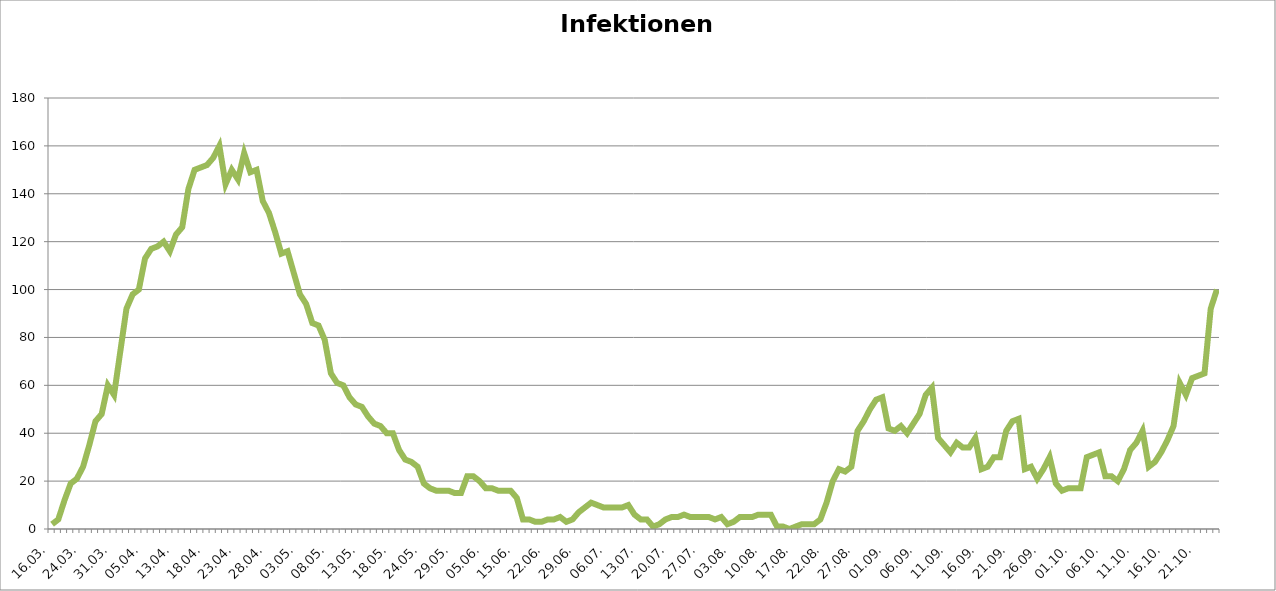
| Category | Infektionen
aktuell |
|---|---|
| 16.03. | 2 |
| 18.03. | 4 |
| 19.03. | 12 |
| 20.03. | 19 |
| 23.03. | 21 |
| 24.03. | 26 |
| 25.03. | 35 |
| 26.03. | 45 |
| 27.03. | 48 |
| 30.03. | 60 |
| 31.03. | 56 |
| 01.04. | 74 |
| 02.04. | 92 |
| 03.04. | 98 |
| 04.04. | 100 |
| 05.04. | 113 |
| 06.04. | 117 |
| 07.04. | 118 |
| 08.04. | 120 |
| 09.04. | 116 |
| 13.04. | 123 |
| 14.04. | 126 |
| 15.04. | 142 |
| 16.04. | 150 |
| 17.04. | 151 |
| 18.04. | 152 |
| 19.04. | 155 |
| 20.04. | 160 |
| 21.04. | 144 |
| 22.04. | 150 |
| 23.04. | 146 |
| 24.04. | 157 |
| 25.04. | 149 |
| 26.04. | 150 |
| 27.04. | 137 |
| 28.04. | 132 |
| 29.04. | 124 |
| 30.04. | 115 |
| 01.05. | 116 |
| 02.05. | 107 |
| 03.05. | 98 |
| 04.05. | 94 |
| 05.05. | 86 |
| 06.05. | 85 |
| 07.05. | 79 |
| 08.05. | 65 |
| 09.05. | 61 |
| 10.05. | 60 |
| 11.05. | 55 |
| 12.05. | 52 |
| 13.05. | 51 |
| 14.05. | 47 |
| 15.05. | 44 |
| 16.05. | 43 |
| 17.05. | 40 |
| 18.05. | 40 |
| 19.05. | 33 |
| 20.05. | 29 |
| 22.05. | 28 |
| 23.05. | 26 |
| 24.05. | 19 |
| 25.05. | 17 |
| 26.05. | 16 |
| 27.05. | 16 |
| 28.05. | 16 |
| 29.05. | 15 |
| 30.05. | 15 |
| 02.06. | 22 |
| 03.06. | 22 |
| 04.06. | 20 |
| 05.06. | 17 |
| 08.06. | 17 |
| 09.06. | 16 |
| 10.06. | 16 |
| 12.06. | 16 |
| 15.06. | 13 |
| 16.06. | 4 |
| 17.06. | 4 |
| 18.06. | 3 |
| 19.06. | 3 |
| 22.06. | 4 |
| 23.06. | 4 |
| 24.06. | 5 |
| 25.06. | 3 |
| 26.06. | 4 |
| 29.06. | 7 |
| 30.06. | 9 |
| 01.07. | 11 |
| 02.07. | 10 |
| 03.07. | 9 |
| 06.07. | 9 |
| 07.07. | 9 |
| 08.07. | 9 |
| 09.07. | 10 |
| 10.07. | 6 |
| 13.07. | 4 |
| 14.07. | 4 |
| 15.07. | 1 |
| 16.07. | 2 |
| 17.07. | 4 |
| 20.07. | 5 |
| 21.07. | 5 |
| 22.07. | 6 |
| 23.07. | 5 |
| 24.07. | 5 |
| 27.07. | 5 |
| 28.07. | 5 |
| 29.07. | 4 |
| 30.07. | 5 |
| 31.07. | 2 |
| 03.08. | 3 |
| 04.08. | 5 |
| 05.08. | 5 |
| 06.08. | 5 |
| 07.08. | 6 |
| 10.08. | 6 |
| 11.08. | 6 |
| 12.08. | 1 |
| 13.08. | 1 |
| 14.08. | 0 |
| 17.08. | 1 |
| 18.08. | 2 |
| 19.08. | 2 |
| 20.08. | 2 |
| 21.08. | 4 |
| 22.08. | 11 |
| 23.08. | 20 |
| 24.08. | 25 |
| 25.08. | 24 |
| 26.08. | 26 |
| 27.08. | 41 |
| 28.08. | 45 |
| 29.08. | 50 |
| 30.08. | 54 |
| 31.08. | 55 |
| 01.09. | 42 |
| 02.09. | 41 |
| 03.09. | 43 |
| 04.09. | 40 |
| 05.09. | 44 |
| 06.09. | 48 |
| 07.09. | 56 |
| 08.09. | 59 |
| 09.09. | 38 |
| 10.09. | 35 |
| 11.09. | 32 |
| 12.09. | 36 |
| 13.09. | 34 |
| 14.09. | 34 |
| 15.09. | 38 |
| 16.09. | 25 |
| 17.09. | 26 |
| 18.09. | 30 |
| 19.09. | 30 |
| 20.09. | 41 |
| 21.09. | 45 |
| 22.09. | 46 |
| 23.o9. | 25 |
| 24.09. | 26 |
| 25.09. | 21 |
| 26.09. | 25 |
| 27.09. | 30 |
| 28.09. | 19 |
| 29.09. | 16 |
| 30.09. | 17 |
| 01.10. | 17 |
| 02.10. | 17 |
| 03.10. | 30 |
| 04.10. | 31 |
| 05.10. | 32 |
| 06.10. | 22 |
| 07.10. | 22 |
| 08.10. | 20 |
| 09.10. | 25 |
| 10.10. | 33 |
| 11.10. | 36 |
| 12.10. | 41 |
| 13.10. | 26 |
| 14.10. | 28 |
| 15.10. | 32 |
| 16.10. | 37 |
| 17.10. | 43 |
| 18.10. | 61 |
| 19.10. | 56 |
| 20.10. | 63 |
| 21.10. | 64 |
| 22.10. | 65 |